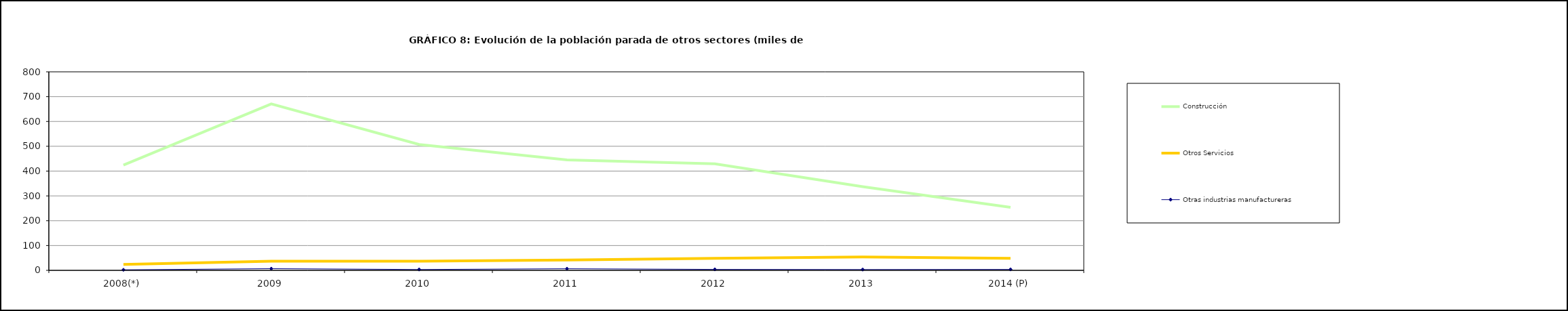
| Category | Construcción | Otros Servicios | Otras industrias manufactureras |
|---|---|---|---|
| 2008(*) | 424.375 | 23.925 | 2.15 |
| 2009 | 670.55 | 37.15 | 6.875 |
| 2010 | 507.325 | 36.775 | 3.475 |
| 2011 | 445 | 41.375 | 6.55 |
| 2012 | 429.35 | 48.3 | 3.85 |
| 2013 | 337.3 | 53.6 | 3.3 |
| 2014 (P) | 253.7 | 48.725 | 3.775 |